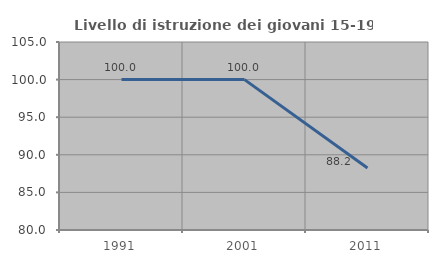
| Category | Livello di istruzione dei giovani 15-19 anni |
|---|---|
| 1991.0 | 100 |
| 2001.0 | 100 |
| 2011.0 | 88.235 |